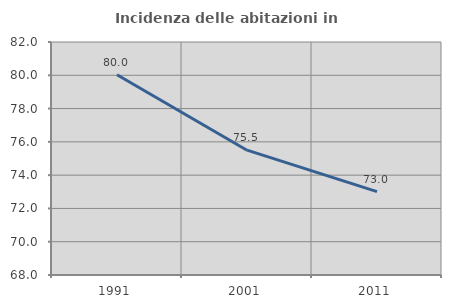
| Category | Incidenza delle abitazioni in proprietà  |
|---|---|
| 1991.0 | 80.033 |
| 2001.0 | 75.5 |
| 2011.0 | 73.011 |